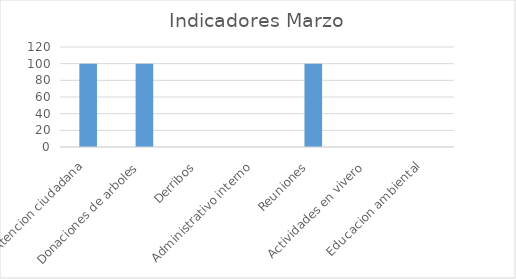
| Category | Series 0 |
|---|---|
| Atencion ciudadana  | 100 |
| Donaciones de arboles  | 100 |
| Derribos  | 0 |
| Administrativo interno  | 0 |
| Reuniones  | 100 |
| Actividades en vivero  | 0 |
| Educacion ambiental  | 0 |